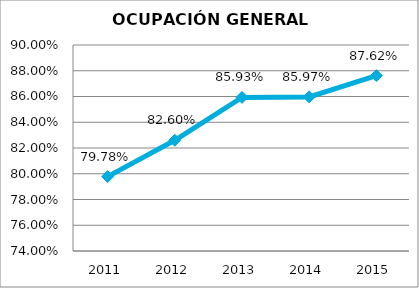
| Category | Series 0 |
|---|---|
| 2011.0 | 0.798 |
| 2012.0 | 0.826 |
| 2013.0 | 0.859 |
| 2014.0 | 0.86 |
| 2015.0 | 0.876 |